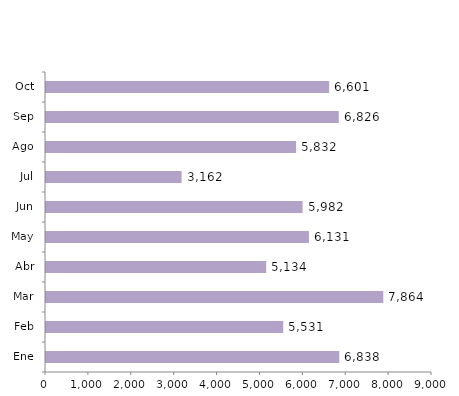
| Category | Series 0 |
|---|---|
| Ene | 6838 |
| Feb | 5531 |
| Mar | 7864 |
| Abr | 5134 |
| May | 6131 |
| Jun | 5982 |
| Jul | 3162 |
| Ago | 5832 |
| Sep | 6826 |
| Oct | 6601 |